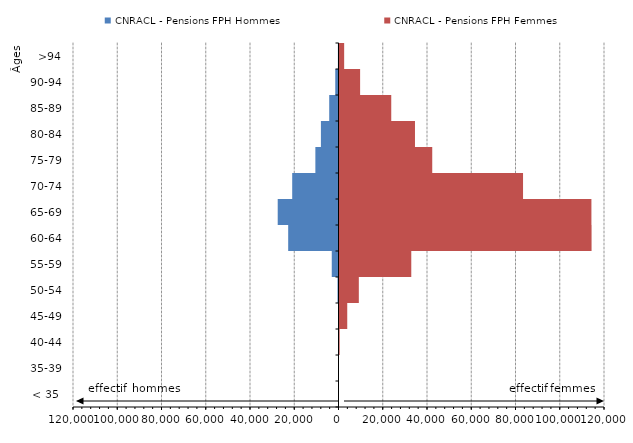
| Category | CNRACL - Pensions FPH Hommes | CNRACL - Pensions FPH Femmes |
|---|---|---|
| < 35  | -7 | 28 |
| 35-39 | -18 | 145 |
| 40-44 | -76 | 524 |
| 45-49 | -199 | 3950 |
| 50-54 | -457 | 9189 |
| 55-59 | -3049 | 32894 |
| 60-64 | -22743 | 114379 |
| 65-69 | -27474 | 114312 |
| 70-74 | -20927 | 83406 |
| 75-79 | -10458 | 42369 |
| 80-84 | -7950 | 34570 |
| 85-89 | -4200 | 23843 |
| 90-94 | -1466 | 9768 |
| >94 | -273 | 2558 |